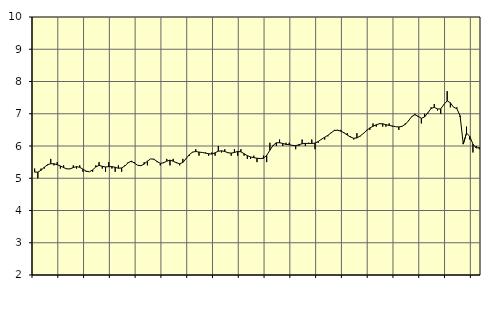
| Category | Piggar | Personliga och kulturella tjänster, SNI 90-981 |
|---|---|---|
| nan | 5.3 | 5.19 |
| 87.0 | 5 | 5.19 |
| 87.0 | 5.3 | 5.25 |
| 87.0 | 5.3 | 5.34 |
| nan | 5.4 | 5.42 |
| 88.0 | 5.6 | 5.45 |
| 88.0 | 5.4 | 5.45 |
| 88.0 | 5.5 | 5.42 |
| nan | 5.3 | 5.38 |
| 89.0 | 5.4 | 5.33 |
| 89.0 | 5.3 | 5.29 |
| 89.0 | 5.3 | 5.29 |
| nan | 5.4 | 5.33 |
| 90.0 | 5.3 | 5.36 |
| 90.0 | 5.4 | 5.34 |
| 90.0 | 5.2 | 5.28 |
| nan | 5.2 | 5.22 |
| 91.0 | 5.2 | 5.2 |
| 91.0 | 5.2 | 5.26 |
| 91.0 | 5.4 | 5.35 |
| nan | 5.5 | 5.4 |
| 92.0 | 5.3 | 5.37 |
| 92.0 | 5.2 | 5.35 |
| 92.0 | 5.5 | 5.36 |
| nan | 5.3 | 5.36 |
| 93.0 | 5.2 | 5.34 |
| 93.0 | 5.4 | 5.31 |
| 93.0 | 5.2 | 5.32 |
| nan | 5.4 | 5.38 |
| 94.0 | 5.5 | 5.48 |
| 94.0 | 5.5 | 5.53 |
| 94.0 | 5.5 | 5.47 |
| nan | 5.4 | 5.4 |
| 95.0 | 5.4 | 5.39 |
| 95.0 | 5.5 | 5.44 |
| 95.0 | 5.4 | 5.53 |
| nan | 5.6 | 5.6 |
| 96.0 | 5.6 | 5.59 |
| 96.0 | 5.5 | 5.52 |
| 96.0 | 5.4 | 5.46 |
| nan | 5.5 | 5.48 |
| 97.0 | 5.6 | 5.53 |
| 97.0 | 5.4 | 5.56 |
| 97.0 | 5.6 | 5.53 |
| nan | 5.5 | 5.48 |
| 98.0 | 5.4 | 5.45 |
| 98.0 | 5.6 | 5.49 |
| 98.0 | 5.6 | 5.61 |
| nan | 5.7 | 5.73 |
| 99.0 | 5.8 | 5.81 |
| 99.0 | 5.9 | 5.83 |
| 99.0 | 5.7 | 5.81 |
| nan | 5.8 | 5.8 |
| 0.0 | 5.8 | 5.78 |
| 0.0 | 5.7 | 5.76 |
| 0.0 | 5.8 | 5.75 |
| nan | 5.7 | 5.79 |
| 1.0 | 6 | 5.84 |
| 1.0 | 5.8 | 5.85 |
| 1.0 | 5.9 | 5.83 |
| nan | 5.8 | 5.79 |
| 2.0 | 5.7 | 5.78 |
| 2.0 | 5.9 | 5.8 |
| 2.0 | 5.7 | 5.83 |
| nan | 5.9 | 5.82 |
| 3.0 | 5.7 | 5.76 |
| 3.0 | 5.6 | 5.7 |
| 3.0 | 5.6 | 5.66 |
| nan | 5.7 | 5.64 |
| 4.0 | 5.5 | 5.62 |
| 4.0 | 5.6 | 5.61 |
| 4.0 | 5.7 | 5.62 |
| nan | 5.5 | 5.71 |
| 5.0 | 6.1 | 5.87 |
| 5.0 | 6 | 6.02 |
| 5.0 | 6 | 6.1 |
| nan | 6.2 | 6.1 |
| 6.0 | 6 | 6.08 |
| 6.0 | 6.1 | 6.05 |
| 6.0 | 6.1 | 6.04 |
| nan | 6 | 6.02 |
| 7.0 | 5.9 | 6.01 |
| 7.0 | 6 | 6.04 |
| 7.0 | 6.2 | 6.07 |
| nan | 6 | 6.08 |
| 8.0 | 6.1 | 6.08 |
| 8.0 | 6.2 | 6.08 |
| 8.0 | 5.9 | 6.09 |
| nan | 6.1 | 6.14 |
| 9.0 | 6.2 | 6.21 |
| 9.0 | 6.2 | 6.27 |
| 9.0 | 6.3 | 6.33 |
| nan | 6.4 | 6.41 |
| 10.0 | 6.5 | 6.48 |
| 10.0 | 6.5 | 6.49 |
| 10.0 | 6.5 | 6.46 |
| nan | 6.4 | 6.41 |
| 11.0 | 6.4 | 6.34 |
| 11.0 | 6.3 | 6.28 |
| 11.0 | 6.2 | 6.24 |
| nan | 6.4 | 6.25 |
| 12.0 | 6.3 | 6.31 |
| 12.0 | 6.4 | 6.39 |
| 12.0 | 6.5 | 6.48 |
| nan | 6.5 | 6.56 |
| 13.0 | 6.7 | 6.61 |
| 13.0 | 6.6 | 6.66 |
| 13.0 | 6.7 | 6.69 |
| nan | 6.6 | 6.69 |
| 14.0 | 6.6 | 6.66 |
| 14.0 | 6.7 | 6.64 |
| 14.0 | 6.6 | 6.62 |
| nan | 6.6 | 6.6 |
| 15.0 | 6.5 | 6.59 |
| 15.0 | 6.6 | 6.61 |
| 15.0 | 6.7 | 6.67 |
| nan | 6.8 | 6.78 |
| 16.0 | 6.9 | 6.91 |
| 16.0 | 7 | 6.97 |
| 16.0 | 6.9 | 6.92 |
| nan | 6.7 | 6.86 |
| 17.0 | 7 | 6.9 |
| 17.0 | 7 | 7.03 |
| 17.0 | 7.2 | 7.16 |
| nan | 7.3 | 7.2 |
| 18.0 | 7.1 | 7.15 |
| 18.0 | 7 | 7.15 |
| 18.0 | 7.3 | 7.29 |
| nan | 7.7 | 7.4 |
| 19.0 | 7.2 | 7.34 |
| 19.0 | 7.2 | 7.2 |
| 19.0 | 7.2 | 7.16 |
| nan | 6.9 | 6.94 |
| 20.0 | 6.1 | 6.06 |
| 20.0 | 6.6 | 6.4 |
| 20.0 | 6.2 | 6.3 |
| nan | 5.8 | 6.06 |
| 21.0 | 6 | 5.94 |
| 21.0 | 5.9 | 5.95 |